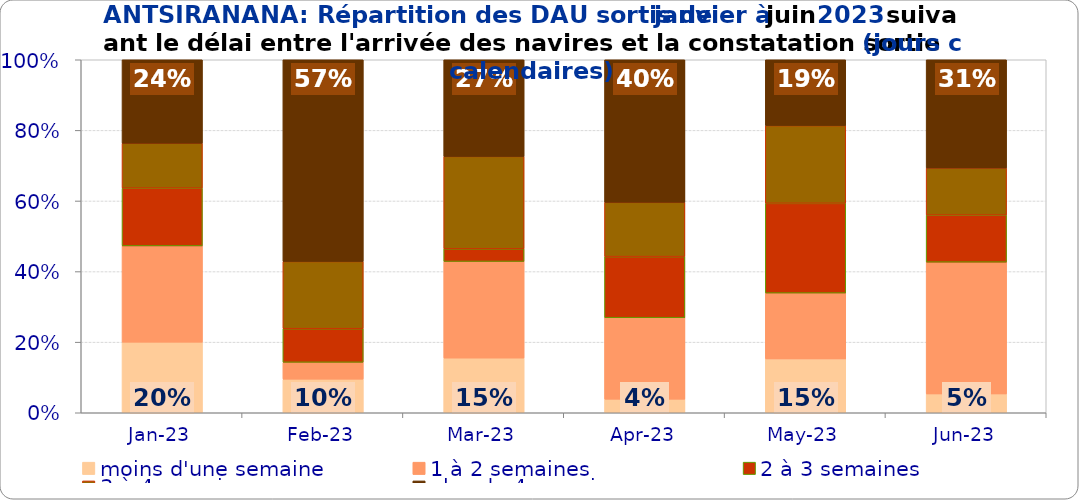
| Category | moins d'une semaine | 1 à 2 semaines | 2 à 3 semaines | 3 à 4 semaines | plus de 4 semaines |
|---|---|---|---|---|---|
| 2023-01-01 | 0.2 | 0.273 | 0.164 | 0.127 | 0.236 |
| 2023-02-01 | 0.095 | 0.048 | 0.095 | 0.19 | 0.571 |
| 2023-03-01 | 0.155 | 0.274 | 0.036 | 0.262 | 0.274 |
| 2023-04-01 | 0.038 | 0.231 | 0.173 | 0.154 | 0.404 |
| 2023-05-01 | 0.153 | 0.186 | 0.254 | 0.22 | 0.186 |
| 2023-06-01 | 0.053 | 0.373 | 0.133 | 0.133 | 0.307 |